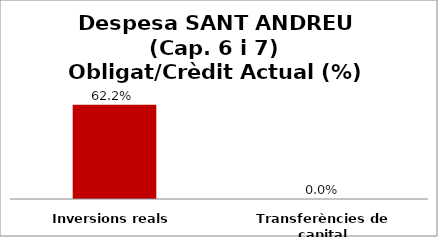
| Category | Series 0 |
|---|---|
| Inversions reals | 0.622 |
| Transferències de capital | 0 |